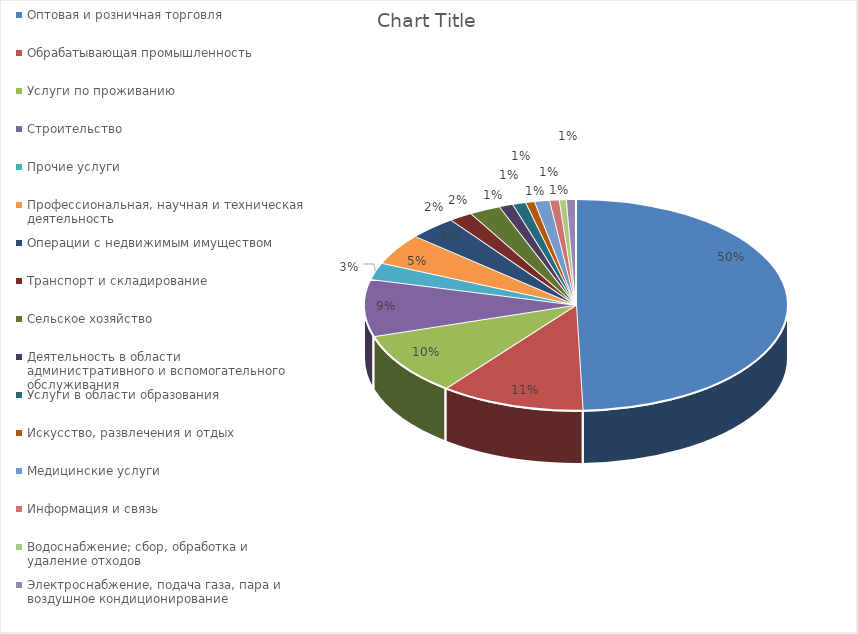
| Category | Series 0 |
|---|---|
| Оптовая и розничная торговля | 0.495 |
| Обрабатывающая промышленность | 0.11 |
| Услуги по проживанию | 0.097 |
| Строительство | 0.087 |
| Прочие услуги | 0.026 |
| Профессиональная, научная и техническая деятельность | 0.048 |
| Операции с недвижимым имуществом | 0.037 |
| Транспорт и складирование | 0.018 |
| Сельское хозяйство | 0.024 |
| Деятельность в области административного и вспомогательного обслуживания | 0.011 |
| Услуги в области образования | 0.01 |
| Искусство, развлечения и отдых | 0.007 |
| Медицинские услуги | 0.011 |
| Информация и связь | 0.007 |
| Водоснабжение; сбор, обработка и удаление отходов | 0.005 |
| Электроснабжение, подача газа, пара и воздушное кондиционирование | 0.007 |